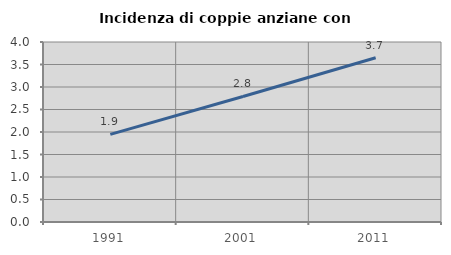
| Category | Incidenza di coppie anziane con figli |
|---|---|
| 1991.0 | 1.946 |
| 2001.0 | 2.79 |
| 2011.0 | 3.651 |